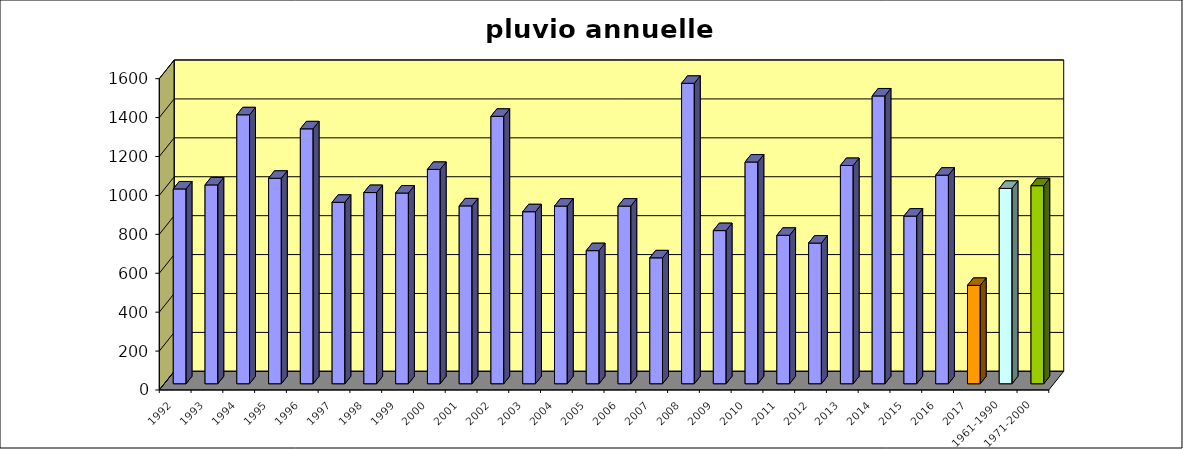
| Category | 1992 1993 1994 1995 1996 1997 1998 1999 2000 2001 2002 2003 2004 2005 2006 2007 2008 2009 2010 2011 2012 2013 2014 2015 2016 2017 1961-1990 1971-2000 |
|---|---|
| 1992 | 1001.1 |
| 1993 | 1021.8 |
| 1994 | 1382.2 |
| 1995 | 1056 |
| 1996 | 1310 |
| 1997 | 932.5 |
| 1998 | 982.5 |
| 1999 | 980 |
| 2000 | 1101.5 |
| 2001 | 914 |
| 2002 | 1374.5 |
| 2003 | 884 |
| 2004 | 913 |
| 2005 | 684 |
| 2006 | 913 |
| 2007 | 647 |
| 2008 | 1544 |
| 2009 | 787 |
| 2010 | 1139.5 |
| 2011 | 763 |
| 2012 | 723 |
| 2013 | 1121.5 |
| 2014 | 1479 |
| 2015 | 861.5 |
| 2016 | 1072 |
| 2017 | 505.5 |
| 1961-1990 | 1004 |
| 1971-2000 | 1017.8 |